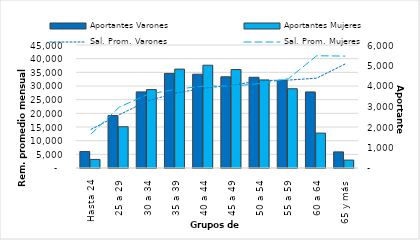
| Category | Aportantes Varones | Aportantes Mujeres |
|---|---|---|
| 0 | 802 | 419 |
| 1 | 2559 | 2013 |
| 2 | 3711 | 3824 |
| 3 | 4614 | 4824 |
| 4 | 4574 | 5014 |
| 5 | 4449 | 4804 |
| 6 | 4426 | 4298 |
| 7 | 4277 | 3866 |
| 8 | 3710 | 1702 |
| 9 | 786 | 386 |